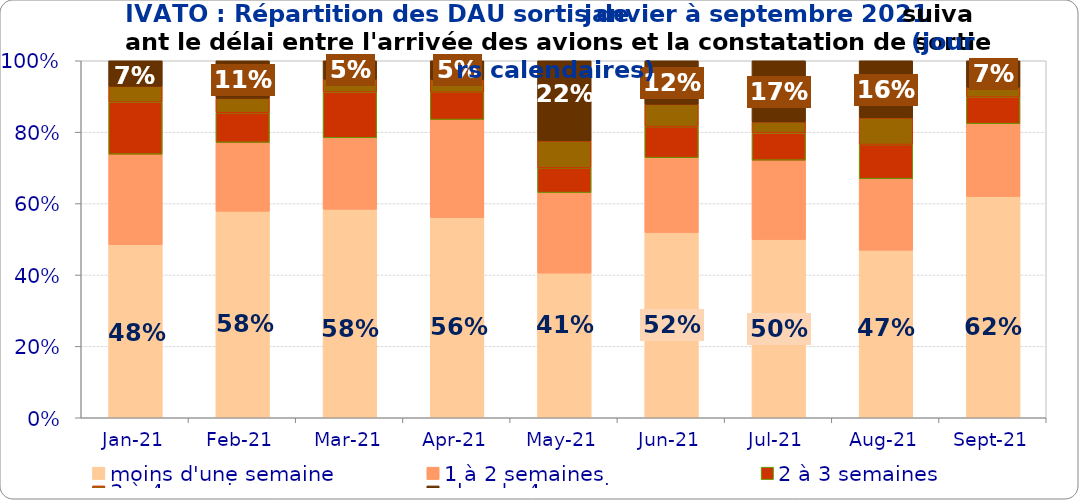
| Category | moins d'une semaine | 1 à 2 semaines | 2 à 3 semaines | 3 à 4 semaines | plus de 4 semaines |
|---|---|---|---|---|---|
| 2021-01-01 | 0.485 | 0.253 | 0.146 | 0.044 | 0.072 |
| 2021-02-01 | 0.578 | 0.193 | 0.083 | 0.04 | 0.105 |
| 2021-03-01 | 0.584 | 0.2 | 0.128 | 0.036 | 0.052 |
| 2021-04-01 | 0.561 | 0.275 | 0.076 | 0.035 | 0.053 |
| 2021-05-01 | 0.405 | 0.226 | 0.069 | 0.076 | 0.224 |
| 2021-06-01 | 0.519 | 0.21 | 0.087 | 0.063 | 0.122 |
| 2021-07-01 | 0.499 | 0.222 | 0.076 | 0.031 | 0.171 |
| 2021-08-01 | 0.469 | 0.2 | 0.096 | 0.075 | 0.16 |
| 2021-09-01 | 0.62 | 0.204 | 0.074 | 0.028 | 0.074 |